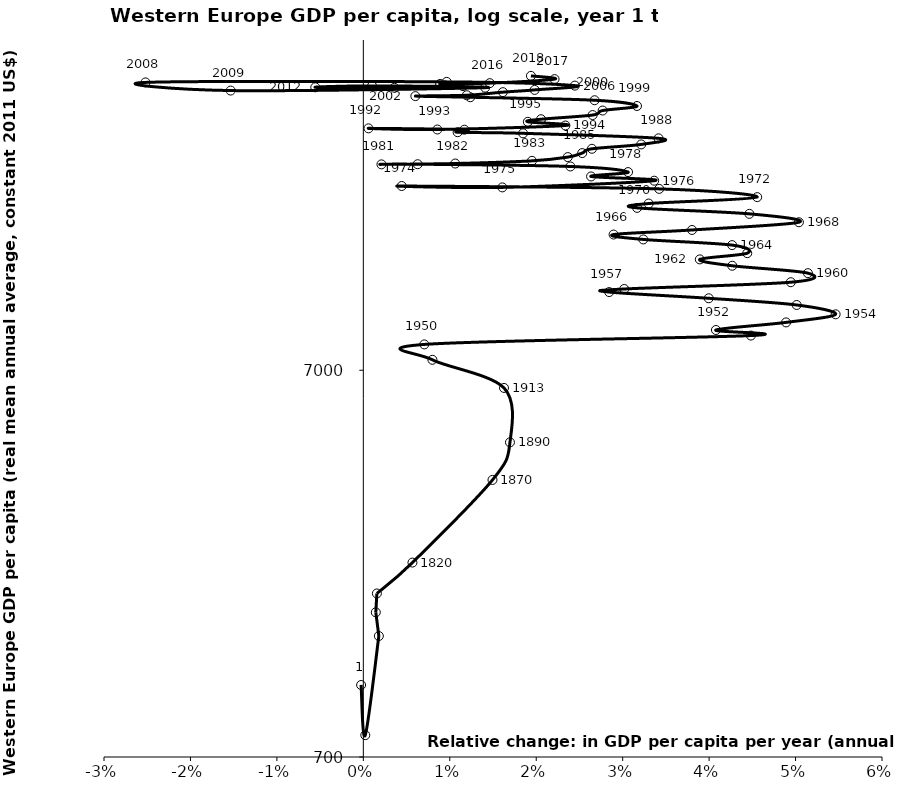
| Category | Series 0 |
|---|---|
| -0.00025841590840489765 | 1074.708 |
| 0.00022569376856694293 | 797.264 |
| 0.001795560946347402 | 1438.298 |
| 0.0014418680676868145 | 1656.186 |
| 0.0015679249124853024 | 1853.066 |
| 0.0056819494901432215 | 2227.477 |
| 0.014940173911855746 | 3643 |
| 0.016961487146422895 | 4557 |
| 0.016272513968366504 | 6300 |
| 0.007992277992277993 | 7449 |
| 0.0070540279964363736 | 8163 |
| 0.04483645718485851 | 8605 |
| 0.04079023823358512 | 8895 |
| 0.048903878583473864 | 9307 |
| 0.05463629526163103 | 9765 |
| 0.050128008192524325 | 10324 |
| 0.03995544362650136 | 10744 |
| 0.028434475055845124 | 11149 |
| 0.0301820791102341 | 11355 |
| 0.04944958168207838 | 11822 |
| 0.05142953814921333 | 12478 |
| 0.04267510819041513 | 13038 |
| 0.03892468169964718 | 13543 |
| 0.0444140884589825 | 14053 |
| 0.04265993026400057 | 14746 |
| 0.03238166282381663 | 15252 |
| 0.028947023341201153 | 15701 |
| 0.03802305585631489 | 16135 |
| 0.05038735667802913 | 16895 |
| 0.04465818289434744 | 17761 |
| 0.03167051404763245 | 18404 |
| 0.033009128450336885 | 18886 |
| 0.04556285078894419 | 19619 |
| 0.03422702482287578 | 20607 |
| 0.004440238753821517 | 20962 |
| 0.01607671023757275 | 20790 |
| 0.033645983645983646 | 21636 |
| 0.02634498058790904 | 22189 |
| 0.030623281806300418 | 22776 |
| 0.02395064980681419 | 23548 |
| 0.006285034822490233 | 23867 |
| 0.00209494280806134 | 23844 |
| 0.010631605435329643 | 23967 |
| 0.01950598739934076 | 24351 |
| 0.023654059381544905 | 24902 |
| 0.025319251465745724 | 25503 |
| 0.026447868878171195 | 26163 |
| 0.03214463173183504 | 26852 |
| 0.034150156412930135 | 27845 |
| 0.0184772849703717 | 28686 |
| 0.01091124590392526 | 28874 |
| 0.011688716492346055 | 29312 |
| 0.0005970251091703057 | 29549 |
| 0.008562049477139667 | 29347 |
| 0.023375472791085972 | 30055 |
| 0.019031775079021793 | 30719 |
| 0.020557309808261988 | 31199 |
| 0.0265232860027565 | 31982 |
| 0.02768744919016947 | 32854 |
| 0.03165520180191149 | 33753 |
| 0.02675317749533375 | 34934 |
| 0.012366176218011107 | 35559 |
| 0.006018166990072836 | 35798 |
| 0.011969942454885748 | 35987 |
| 0.016144718926278934 | 36655 |
| 0.019819942709043786 | 37149 |
| 0.024469030121941373 | 38108 |
| 0.00964364437913299 | 38967 |
| -0.02520081094259245 | 38843 |
| -0.015343819993306387 | 37003 |
| 0.014093451882279815 | 37651 |
| 0.0010092693421157473 | 38046 |
| -0.005559060085160069 | 37727 |
| 0.0035915922283775545 | 37623 |
| 0.011522207160513515 | 37998 |
| 0.008882046423495974 | 38490 |
| 0.01462441013708499 | 38673 |
| 0.022120101332675102 | 39615.787 |
| 0.019389095148700408 | 40383.901 |